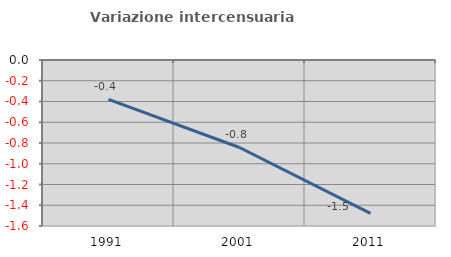
| Category | Variazione intercensuaria annua |
|---|---|
| 1991.0 | -0.38 |
| 2001.0 | -0.843 |
| 2011.0 | -1.479 |